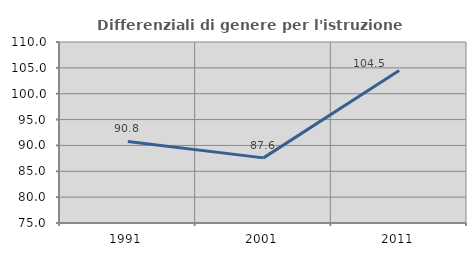
| Category | Differenziali di genere per l'istruzione superiore |
|---|---|
| 1991.0 | 90.761 |
| 2001.0 | 87.592 |
| 2011.0 | 104.51 |